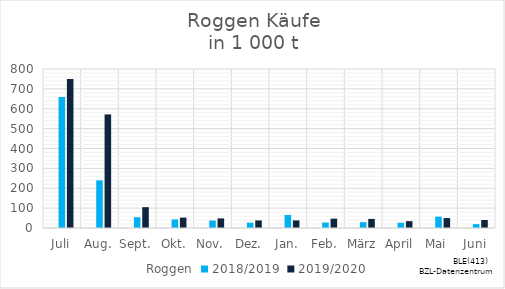
| Category | Roggen | 2018/2019 | 2019/2020 |
|---|---|---|---|
| Juli |  | 658.951 | 750.133 |
| Aug. |  | 239.754 | 571.557 |
| Sept. |  | 54.172 | 104.778 |
| Okt. |  | 43.208 | 52.18 |
| Nov. |  | 37.468 | 48.346 |
| Dez. |  | 26.844 | 38.103 |
| Jan. |  | 65.837 | 38.298 |
| Feb. |  | 27.414 | 47.088 |
| März |  | 29.216 | 45.709 |
| April |  | 26.559 | 34.307 |
| Mai |  | 57.025 | 49.879 |
| Juni |  | 19.483 | 40.439 |